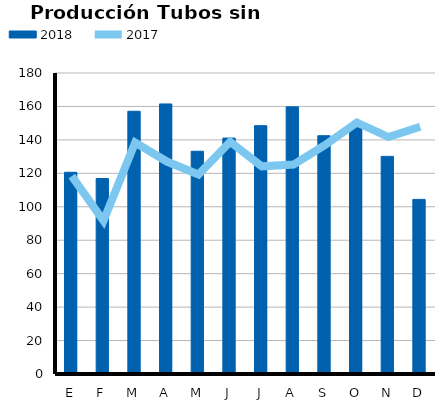
| Category | 2018 |
|---|---|
| E | 120.629 |
| F | 116.901 |
| M | 157.112 |
| A | 161.492 |
| M | 133.211 |
| J | 141.08 |
| J | 148.488 |
| A | 159.766 |
| S | 142.502 |
| O | 147.52 |
| N | 130.137 |
| D | 104.421 |